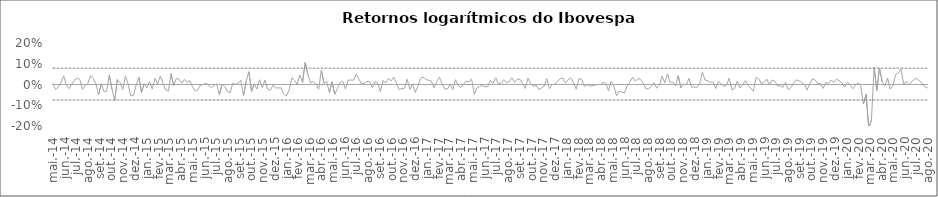
| Category | IBOV | Series 6 | Series 7 |
|---|---|---|---|
| 2014-05-19 | 0.004 | 0.079 | -0.075 |
| 2014-05-26 | -0.025 | 0.079 | -0.075 |
| 2014-06-02 | -0.012 | 0.079 | -0.075 |
| 2014-06-09 | 0.011 | 0.079 | -0.075 |
| 2014-06-16 | 0.041 | 0.079 | -0.075 |
| 2014-06-23 | -0.004 | 0.079 | -0.075 |
| 2014-06-30 | -0.02 | 0.079 | -0.075 |
| 2014-07-07 | 0.001 | 0.079 | -0.075 |
| 2014-07-14 | 0.02 | 0.079 | -0.075 |
| 2014-07-21 | 0.031 | 0.079 | -0.075 |
| 2014-07-28 | 0.024 | 0.079 | -0.075 |
| 2014-08-04 | -0.023 | 0.079 | -0.075 |
| 2014-08-11 | -0.005 | 0.079 | -0.075 |
| 2014-08-18 | 0.004 | 0.079 | -0.075 |
| 2014-08-25 | 0.042 | 0.079 | -0.075 |
| 2014-09-01 | 0.03 | 0.079 | -0.075 |
| 2014-09-08 | 0.003 | 0.079 | -0.075 |
| 2014-09-15 | -0.048 | 0.079 | -0.075 |
| 2014-09-22 | 0.004 | 0.079 | -0.075 |
| 2014-09-29 | -0.035 | 0.079 | -0.075 |
| 2014-10-06 | -0.033 | 0.079 | -0.075 |
| 2014-10-13 | 0.046 | 0.079 | -0.075 |
| 2014-10-20 | -0.023 | 0.079 | -0.075 |
| 2014-10-27 | -0.076 | 0.079 | -0.075 |
| 2014-11-03 | 0.024 | 0.079 | -0.075 |
| 2014-11-10 | 0.009 | 0.079 | -0.075 |
| 2014-11-17 | -0.024 | 0.079 | -0.075 |
| 2014-11-24 | 0.041 | 0.079 | -0.075 |
| 2014-12-01 | 0.004 | 0.079 | -0.075 |
| 2014-12-08 | -0.055 | 0.079 | -0.075 |
| 2014-12-15 | -0.052 | 0.079 | -0.075 |
| 2014-12-22 | -0.003 | 0.079 | -0.075 |
| 2014-12-29 | 0.035 | 0.079 | -0.075 |
| 2015-01-05 | -0.038 | 0.079 | -0.075 |
| 2015-01-12 | 0.004 | 0.079 | -0.075 |
| 2015-01-19 | -0.016 | 0.079 | -0.075 |
| 2015-01-26 | 0.014 | 0.079 | -0.075 |
| 2015-02-02 | -0.022 | 0.079 | -0.075 |
| 2015-02-09 | 0.029 | 0.079 | -0.075 |
| 2015-02-16 | 0.002 | 0.079 | -0.075 |
| 2015-02-23 | 0.041 | 0.079 | -0.075 |
| 2015-03-02 | 0.007 | 0.079 | -0.075 |
| 2015-03-09 | -0.027 | 0.079 | -0.075 |
| 2015-03-16 | -0.031 | 0.079 | -0.075 |
| 2015-03-23 | 0.052 | 0.079 | -0.075 |
| 2015-03-30 | -0.005 | 0.079 | -0.075 |
| 2015-04-06 | 0.029 | 0.079 | -0.075 |
| 2015-04-13 | 0.025 | 0.079 | -0.075 |
| 2015-04-20 | 0.006 | 0.079 | -0.075 |
| 2015-04-27 | 0.025 | 0.079 | -0.075 |
| 2015-05-04 | 0.01 | 0.079 | -0.075 |
| 2015-05-11 | 0.019 | 0.079 | -0.075 |
| 2015-05-18 | -0.011 | 0.079 | -0.075 |
| 2015-05-25 | -0.031 | 0.079 | -0.075 |
| 2015-06-01 | -0.025 | 0.079 | -0.075 |
| 2015-06-08 | -0.003 | 0.079 | -0.075 |
| 2015-06-15 | 0 | 0.079 | -0.075 |
| 2015-06-22 | 0.007 | 0.079 | -0.075 |
| 2015-06-29 | -0.004 | 0.079 | -0.075 |
| 2015-07-06 | -0.016 | 0.079 | -0.075 |
| 2015-07-13 | -0.005 | 0.079 | -0.075 |
| 2015-07-20 | 0.003 | 0.079 | -0.075 |
| 2015-07-27 | -0.051 | 0.079 | -0.075 |
| 2015-08-03 | 0.002 | 0.079 | -0.075 |
| 2015-08-10 | -0.01 | 0.079 | -0.075 |
| 2015-08-17 | -0.033 | 0.079 | -0.075 |
| 2015-08-24 | -0.04 | 0.079 | -0.075 |
| 2015-08-31 | 0.006 | 0.079 | -0.075 |
| 2015-09-07 | 0.001 | 0.079 | -0.075 |
| 2015-09-14 | 0.006 | 0.079 | -0.075 |
| 2015-09-21 | 0.02 | 0.079 | -0.075 |
| 2015-09-28 | -0.054 | 0.079 | -0.075 |
| 2015-10-05 | 0.015 | 0.079 | -0.075 |
| 2015-10-12 | 0.062 | 0.079 | -0.075 |
| 2015-10-19 | -0.033 | 0.079 | -0.075 |
| 2015-10-26 | 0.003 | 0.079 | -0.075 |
| 2015-11-02 | -0.022 | 0.079 | -0.075 |
| 2015-11-09 | 0.023 | 0.079 | -0.075 |
| 2015-11-16 | -0.015 | 0.079 | -0.075 |
| 2015-11-23 | 0.022 | 0.079 | -0.075 |
| 2015-11-30 | -0.023 | 0.079 | -0.075 |
| 2015-12-07 | -0.028 | 0.079 | -0.075 |
| 2015-12-14 | -0.003 | 0.079 | -0.075 |
| 2015-12-21 | -0.018 | 0.079 | -0.075 |
| 2015-12-28 | -0.016 | 0.079 | -0.075 |
| 2016-01-04 | -0.016 | 0.079 | -0.075 |
| 2016-01-11 | -0.047 | 0.079 | -0.075 |
| 2016-01-18 | -0.055 | 0.079 | -0.075 |
| 2016-01-25 | -0.027 | 0.079 | -0.075 |
| 2016-02-01 | 0.032 | 0.079 | -0.075 |
| 2016-02-08 | 0.02 | 0.079 | -0.075 |
| 2016-02-15 | 0 | 0.079 | -0.075 |
| 2016-02-22 | 0.046 | 0.079 | -0.075 |
| 2016-02-29 | 0.01 | 0.079 | -0.075 |
| 2016-03-07 | 0.106 | 0.079 | -0.075 |
| 2016-03-14 | 0.047 | 0.079 | -0.075 |
| 2016-03-21 | 0.008 | 0.079 | -0.075 |
| 2016-03-28 | 0.015 | 0.079 | -0.075 |
| 2016-04-04 | 0.001 | 0.079 | -0.075 |
| 2016-04-11 | -0.023 | 0.079 | -0.075 |
| 2016-04-18 | 0.069 | 0.079 | -0.075 |
| 2016-04-25 | 0.005 | 0.079 | -0.075 |
| 2016-05-02 | 0.016 | 0.079 | -0.075 |
| 2016-05-09 | -0.038 | 0.079 | -0.075 |
| 2016-05-16 | 0.013 | 0.079 | -0.075 |
| 2016-05-23 | -0.047 | 0.079 | -0.075 |
| 2016-05-30 | -0.018 | 0.079 | -0.075 |
| 2016-06-06 | 0.01 | 0.079 | -0.075 |
| 2016-06-13 | 0.016 | 0.079 | -0.075 |
| 2016-06-20 | -0.022 | 0.079 | -0.075 |
| 2016-06-27 | 0.02 | 0.079 | -0.075 |
| 2016-07-04 | 0.021 | 0.079 | -0.075 |
| 2016-07-11 | 0.021 | 0.079 | -0.075 |
| 2016-07-18 | 0.05 | 0.079 | -0.075 |
| 2016-07-25 | 0.026 | 0.079 | -0.075 |
| 2016-08-01 | 0.002 | 0.079 | -0.075 |
| 2016-08-08 | 0.006 | 0.079 | -0.075 |
| 2016-08-15 | 0.015 | 0.079 | -0.075 |
| 2016-08-22 | 0.013 | 0.079 | -0.075 |
| 2016-08-29 | -0.015 | 0.079 | -0.075 |
| 2016-09-05 | 0.014 | 0.079 | -0.075 |
| 2016-09-12 | 0.008 | 0.079 | -0.075 |
| 2016-09-19 | -0.034 | 0.079 | -0.075 |
| 2016-09-26 | 0.02 | 0.079 | -0.075 |
| 2016-10-03 | 0.007 | 0.079 | -0.075 |
| 2016-10-10 | 0.03 | 0.079 | -0.075 |
| 2016-10-17 | 0.017 | 0.079 | -0.075 |
| 2016-10-24 | 0.035 | 0.079 | -0.075 |
| 2016-10-31 | 0.006 | 0.079 | -0.075 |
| 2016-11-07 | -0.024 | 0.079 | -0.075 |
| 2016-11-14 | -0.019 | 0.079 | -0.075 |
| 2016-11-21 | -0.018 | 0.079 | -0.075 |
| 2016-11-28 | 0.025 | 0.079 | -0.075 |
| 2016-12-05 | -0.024 | 0.079 | -0.075 |
| 2016-12-12 | 0.001 | 0.079 | -0.075 |
| 2016-12-19 | -0.039 | 0.079 | -0.075 |
| 2016-12-26 | -0.008 | 0.079 | -0.075 |
| 2017-01-02 | 0.03 | 0.079 | -0.075 |
| 2017-01-09 | 0.036 | 0.079 | -0.075 |
| 2017-01-16 | 0.023 | 0.079 | -0.075 |
| 2017-01-23 | 0.021 | 0.079 | -0.075 |
| 2017-01-30 | 0.016 | 0.079 | -0.075 |
| 2017-02-06 | -0.015 | 0.079 | -0.075 |
| 2017-02-13 | 0.012 | 0.079 | -0.075 |
| 2017-02-20 | 0.035 | 0.079 | -0.075 |
| 2017-02-27 | 0.003 | 0.079 | -0.075 |
| 2017-03-06 | -0.022 | 0.079 | -0.075 |
| 2017-03-13 | -0.022 | 0.079 | -0.075 |
| 2017-03-20 | 0.002 | 0.079 | -0.075 |
| 2017-03-27 | -0.024 | 0.079 | -0.075 |
| 2017-04-03 | 0.023 | 0.079 | -0.075 |
| 2017-04-10 | -0.005 | 0.079 | -0.075 |
| 2017-04-17 | -0.015 | 0.079 | -0.075 |
| 2017-04-24 | 0.001 | 0.079 | -0.075 |
| 2017-05-01 | 0.017 | 0.079 | -0.075 |
| 2017-05-08 | 0.012 | 0.079 | -0.075 |
| 2017-05-15 | 0.027 | 0.079 | -0.075 |
| 2017-05-22 | -0.048 | 0.079 | -0.075 |
| 2017-05-29 | -0.016 | 0.079 | -0.075 |
| 2017-06-05 | -0.01 | 0.079 | -0.075 |
| 2017-06-12 | -0.004 | 0.079 | -0.075 |
| 2017-06-19 | -0.011 | 0.079 | -0.075 |
| 2017-06-26 | -0.01 | 0.079 | -0.075 |
| 2017-07-03 | 0.02 | 0.079 | -0.075 |
| 2017-07-10 | 0.007 | 0.079 | -0.075 |
| 2017-07-17 | 0.032 | 0.079 | -0.075 |
| 2017-07-24 | 0.002 | 0.079 | -0.075 |
| 2017-07-31 | 0.007 | 0.079 | -0.075 |
| 2017-08-07 | 0.024 | 0.079 | -0.075 |
| 2017-08-14 | 0.009 | 0.079 | -0.075 |
| 2017-08-21 | 0.012 | 0.079 | -0.075 |
| 2017-08-28 | 0.033 | 0.079 | -0.075 |
| 2017-09-04 | 0.01 | 0.079 | -0.075 |
| 2017-09-11 | 0.025 | 0.079 | -0.075 |
| 2017-09-18 | 0.026 | 0.079 | -0.075 |
| 2017-09-25 | 0.004 | 0.079 | -0.075 |
| 2017-10-02 | -0.019 | 0.079 | -0.075 |
| 2017-10-09 | 0.03 | 0.079 | -0.075 |
| 2017-10-16 | 0.007 | 0.079 | -0.075 |
| 2017-10-23 | -0.009 | 0.079 | -0.075 |
| 2017-10-30 | -0.003 | 0.079 | -0.075 |
| 2017-11-06 | -0.025 | 0.079 | -0.075 |
| 2017-11-13 | -0.017 | 0.079 | -0.075 |
| 2017-11-20 | -0.008 | 0.079 | -0.075 |
| 2017-11-27 | 0.029 | 0.079 | -0.075 |
| 2017-12-04 | -0.021 | 0.079 | -0.075 |
| 2017-12-11 | -0.001 | 0.079 | -0.075 |
| 2017-12-18 | 0.003 | 0.079 | -0.075 |
| 2017-12-25 | 0.015 | 0.079 | -0.075 |
| 2018-01-01 | 0.027 | 0.079 | -0.075 |
| 2018-01-08 | 0.032 | 0.079 | -0.075 |
| 2018-01-15 | 0.006 | 0.079 | -0.075 |
| 2018-01-22 | 0.023 | 0.079 | -0.075 |
| 2018-01-29 | 0.032 | 0.079 | -0.075 |
| 2018-02-05 | 0.006 | 0.079 | -0.075 |
| 2018-02-12 | -0.023 | 0.079 | -0.075 |
| 2018-02-19 | 0.027 | 0.079 | -0.075 |
| 2018-02-26 | 0.025 | 0.079 | -0.075 |
| 2018-03-05 | -0.009 | 0.079 | -0.075 |
| 2018-03-12 | 0 | 0.079 | -0.075 |
| 2018-03-19 | -0.008 | 0.079 | -0.075 |
| 2018-03-26 | -0.007 | 0.079 | -0.075 |
| 2018-04-02 | -0.003 | 0.079 | -0.075 |
| 2018-04-09 | 0 | 0.079 | -0.075 |
| 2018-04-16 | 0 | 0.079 | -0.075 |
| 2018-04-23 | 0.01 | 0.079 | -0.075 |
| 2018-04-30 | 0.006 | 0.079 | -0.075 |
| 2018-05-07 | -0.029 | 0.079 | -0.075 |
| 2018-05-14 | 0.015 | 0.079 | -0.075 |
| 2018-05-21 | -0.008 | 0.079 | -0.075 |
| 2018-05-28 | -0.054 | 0.079 | -0.075 |
| 2018-06-04 | -0.031 | 0.079 | -0.075 |
| 2018-06-11 | -0.037 | 0.079 | -0.075 |
| 2018-06-18 | -0.041 | 0.079 | -0.075 |
| 2018-06-25 | -0.005 | 0.079 | -0.075 |
| 2018-07-02 | 0.012 | 0.079 | -0.075 |
| 2018-07-09 | 0.036 | 0.079 | -0.075 |
| 2018-07-16 | 0.016 | 0.079 | -0.075 |
| 2018-07-23 | 0.029 | 0.079 | -0.075 |
| 2018-07-30 | 0.024 | 0.079 | -0.075 |
| 2018-08-06 | 0.004 | 0.079 | -0.075 |
| 2018-08-13 | -0.021 | 0.079 | -0.075 |
| 2018-08-20 | -0.019 | 0.079 | -0.075 |
| 2018-08-27 | -0.008 | 0.079 | -0.075 |
| 2018-09-03 | 0.008 | 0.079 | -0.075 |
| 2018-09-10 | -0.018 | 0.079 | -0.075 |
| 2018-09-17 | -0.004 | 0.079 | -0.075 |
| 2018-09-24 | 0.04 | 0.079 | -0.075 |
| 2018-10-01 | 0.008 | 0.079 | -0.075 |
| 2018-10-08 | 0.052 | 0.079 | -0.075 |
| 2018-10-15 | 0.009 | 0.079 | -0.075 |
| 2018-10-22 | 0.012 | 0.079 | -0.075 |
| 2018-10-29 | -0.008 | 0.079 | -0.075 |
| 2018-11-05 | 0.043 | 0.079 | -0.075 |
| 2018-11-12 | -0.017 | 0.079 | -0.075 |
| 2018-11-19 | 0.002 | 0.079 | -0.075 |
| 2018-11-26 | -0.002 | 0.079 | -0.075 |
| 2018-12-03 | 0.03 | 0.079 | -0.075 |
| 2018-12-10 | -0.013 | 0.079 | -0.075 |
| 2018-12-17 | -0.012 | 0.079 | -0.075 |
| 2018-12-24 | -0.014 | 0.079 | -0.075 |
| 2018-12-31 | 0.004 | 0.079 | -0.075 |
| 2019-01-07 | 0.06 | 0.079 | -0.075 |
| 2019-01-14 | 0.021 | 0.079 | -0.075 |
| 2019-01-21 | 0.018 | 0.079 | -0.075 |
| 2019-01-28 | 0.011 | 0.079 | -0.075 |
| 2019-02-04 | 0.011 | 0.079 | -0.075 |
| 2019-02-11 | -0.019 | 0.079 | -0.075 |
| 2019-02-18 | 0.014 | 0.079 | -0.075 |
| 2019-02-25 | 0.005 | 0.079 | -0.075 |
| 2019-03-04 | -0.01 | 0.079 | -0.075 |
| 2019-03-11 | -0.004 | 0.079 | -0.075 |
| 2019-03-18 | 0.031 | 0.079 | -0.075 |
| 2019-03-25 | -0.026 | 0.079 | -0.075 |
| 2019-04-01 | -0.018 | 0.079 | -0.075 |
| 2019-04-08 | 0.016 | 0.079 | -0.075 |
| 2019-04-15 | -0.016 | 0.079 | -0.075 |
| 2019-04-22 | -0.004 | 0.079 | -0.075 |
| 2019-04-29 | 0.019 | 0.079 | -0.075 |
| 2019-05-06 | -0.003 | 0.079 | -0.075 |
| 2019-05-13 | -0.017 | 0.079 | -0.075 |
| 2019-05-20 | -0.033 | 0.079 | -0.075 |
| 2019-05-27 | 0.034 | 0.079 | -0.075 |
| 2019-06-03 | 0.028 | 0.079 | -0.075 |
| 2019-06-10 | 0.003 | 0.079 | -0.075 |
| 2019-06-17 | 0.012 | 0.079 | -0.075 |
| 2019-06-24 | 0.026 | 0.079 | -0.075 |
| 2019-07-01 | -0.002 | 0.079 | -0.075 |
| 2019-07-08 | 0.022 | 0.079 | -0.075 |
| 2019-07-15 | 0.016 | 0.079 | -0.075 |
| 2019-07-22 | -0.007 | 0.079 | -0.075 |
| 2019-07-29 | -0.006 | 0.079 | -0.075 |
| 2019-08-05 | -0.014 | 0.079 | -0.075 |
| 2019-08-12 | 0.01 | 0.079 | -0.075 |
| 2019-08-19 | -0.026 | 0.079 | -0.075 |
| 2019-08-26 | -0.015 | 0.079 | -0.075 |
| 2019-09-02 | 0.006 | 0.079 | -0.075 |
| 2019-09-09 | 0.023 | 0.079 | -0.075 |
| 2019-09-16 | 0.017 | 0.079 | -0.075 |
| 2019-09-23 | 0.009 | 0.079 | -0.075 |
| 2019-09-30 | 0.001 | 0.079 | -0.075 |
| 2019-10-07 | -0.027 | 0.079 | -0.075 |
| 2019-10-14 | 0.003 | 0.079 | -0.075 |
| 2019-10-21 | 0.028 | 0.079 | -0.075 |
| 2019-10-28 | 0.022 | 0.079 | -0.075 |
| 2019-11-04 | 0.005 | 0.079 | -0.075 |
| 2019-11-11 | 0.004 | 0.079 | -0.075 |
| 2019-11-18 | -0.019 | 0.079 | -0.075 |
| 2019-11-25 | 0.011 | 0.079 | -0.075 |
| 2019-12-02 | 0.005 | 0.079 | -0.075 |
| 2019-12-09 | 0.021 | 0.079 | -0.075 |
| 2019-12-16 | 0.011 | 0.079 | -0.075 |
| 2019-12-23 | 0.026 | 0.079 | -0.075 |
| 2019-12-30 | 0.017 | 0.079 | -0.075 |
| 2020-01-06 | 0.01 | 0.079 | -0.075 |
| 2020-01-13 | -0.012 | 0.079 | -0.075 |
| 2020-01-20 | 0.011 | 0.079 | -0.075 |
| 2020-01-27 | 0 | 0.079 | -0.075 |
| 2020-02-03 | -0.021 | 0.079 | -0.075 |
| 2020-02-10 | -0.005 | 0.079 | -0.075 |
| 2020-02-17 | 0.007 | 0.079 | -0.075 |
| 2020-02-24 | -0.005 | 0.079 | -0.075 |
| 2020-03-02 | -0.094 | 0.079 | -0.075 |
| 2020-03-09 | -0.047 | 0.079 | -0.075 |
| 2020-03-16 | -0.212 | 0.079 | -0.075 |
| 2020-03-23 | -0.171 | 0.079 | -0.075 |
| 2020-03-30 | 0.084 | 0.079 | -0.075 |
| 2020-04-06 | -0.029 | 0.079 | -0.075 |
| 2020-04-13 | 0.079 | 0.079 | -0.075 |
| 2020-04-20 | 0.013 | 0.079 | -0.075 |
| 2020-04-27 | -0.005 | 0.079 | -0.075 |
| 2020-05-04 | 0.031 | 0.079 | -0.075 |
| 2020-05-11 | -0.022 | 0.079 | -0.075 |
| 2020-05-18 | -0.007 | 0.079 | -0.075 |
| 2020-05-25 | 0.048 | 0.079 | -0.075 |
| 2020-06-01 | 0.055 | 0.079 | -0.075 |
| 2020-06-08 | 0.075 | 0.079 | -0.075 |
| 2020-06-15 | 0.001 | 0.079 | -0.075 |
| 2020-06-22 | 0.013 | 0.079 | -0.075 |
| 2020-06-29 | -0.003 | 0.079 | -0.075 |
| 2020-07-06 | 0.015 | 0.079 | -0.075 |
| 2020-07-13 | 0.025 | 0.079 | -0.075 |
| 2020-07-20 | 0.029 | 0.079 | -0.075 |
| 2020-07-27 | 0.015 | 0.079 | -0.075 |
| 2020-08-03 | 0.005 | 0.079 | -0.075 |
| 2020-08-10 | -0.012 | 0.079 | -0.075 |
| 2020-08-17 | -0.017 | 0.079 | -0.075 |